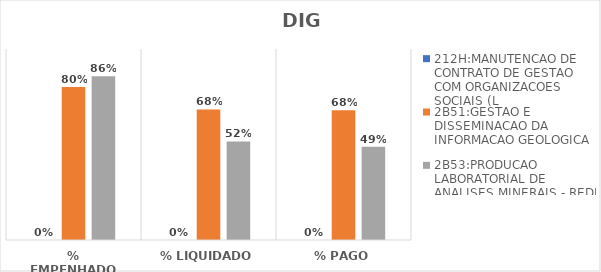
| Category | 212H:MANUTENCAO DE CONTRATO DE GESTAO COM ORGANIZACOES SOCIAIS (L | 2B51:GESTAO E DISSEMINACAO DA INFORMACAO GEOLOGICA | 2B53:PRODUCAO LABORATORIAL DE ANALISES MINERAIS - REDE LAMIN |
|---|---|---|---|
| % EMPENHADO | 0 | 0.801 | 0.858 |
| % LIQUIDADO | 0 | 0.684 | 0.516 |
| % PAGO | 0 | 0.679 | 0.488 |